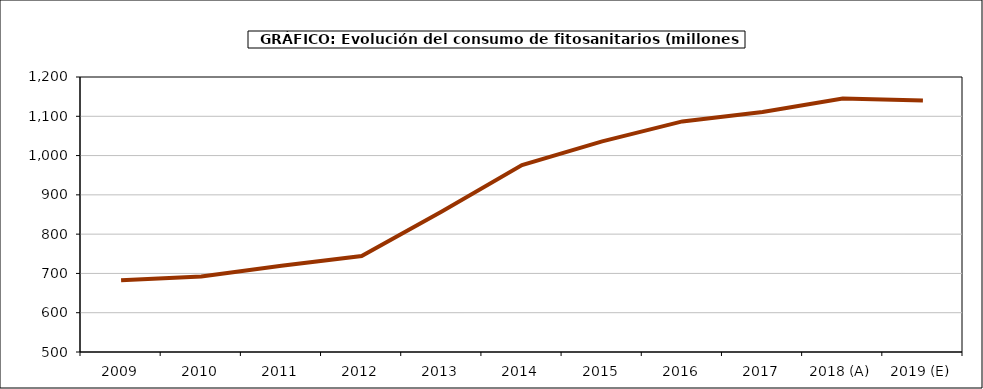
| Category | fitosanitarios |
|---|---|
| 2009 | 682.842 |
| 2010 | 692.238 |
| 2011 | 719.583 |
| 2012 | 744.231 |
| 2013 | 857.443 |
| 2014 | 975.802 |
| 2015 | 1036.274 |
| 2016 | 1086.927 |
| 2017 | 1110.713 |
| 2018 (A) | 1145.257 |
| 2019 (E) | 1140.356 |